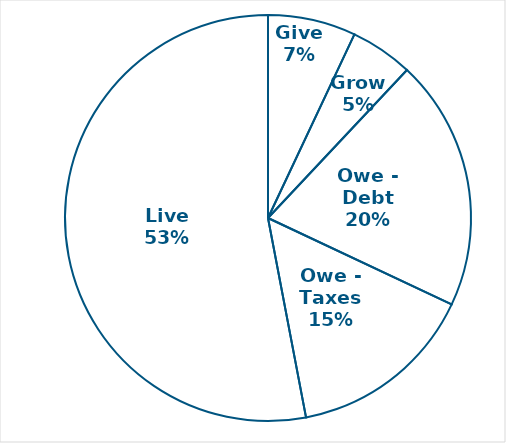
| Category | Series 0 |
|---|---|
| Give | 0.07 |
| Grow | 0.05 |
| Owe - Debt | 0.2 |
| Owe - Taxes | 0.15 |
| Live | 0.53 |